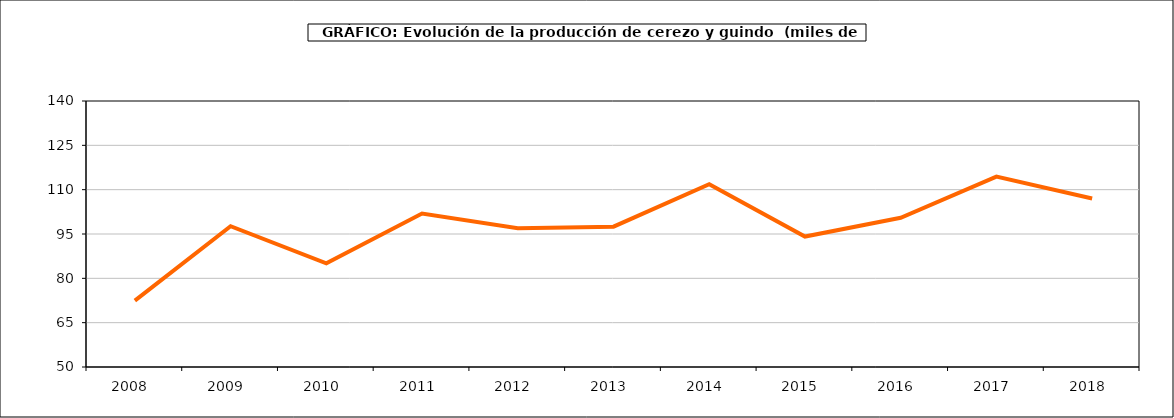
| Category | producción cerezo y guindo |
|---|---|
| 2008.0 | 72.468 |
| 2009.0 | 97.645 |
| 2010.0 | 85.078 |
| 2011.0 | 101.945 |
| 2012.0 | 96.946 |
| 2013.0 | 97.489 |
| 2014.0 | 111.821 |
| 2015.0 | 94.143 |
| 2016.0 | 100.503 |
| 2017.0 | 114.433 |
| 2018.0 | 107 |